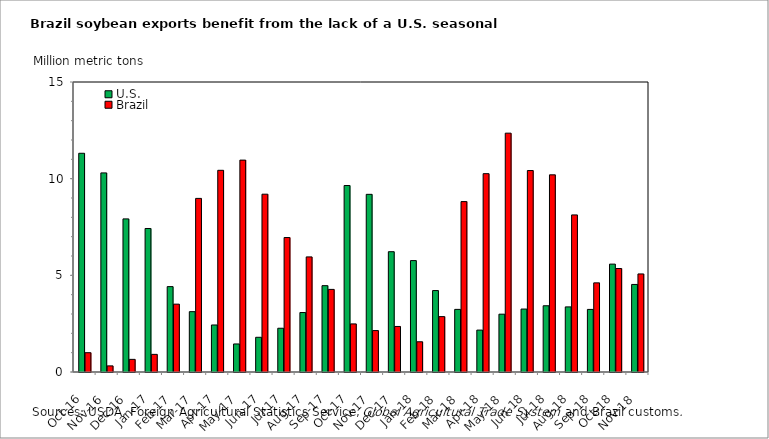
| Category | U.S. | Brazil |
|---|---|---|
| 2016-10-01 | 11.314 | 0.998 |
| 2016-11-01 | 10.299 | 0.316 |
| 2016-12-01 | 7.92 | 0.653 |
| 2017-01-01 | 7.423 | 0.912 |
| 2017-02-01 | 4.416 | 3.509 |
| 2017-03-01 | 3.121 | 8.979 |
| 2017-04-01 | 2.433 | 10.432 |
| 2017-05-01 | 1.45 | 10.96 |
| 2017-06-01 | 1.795 | 9.197 |
| 2017-07-01 | 2.263 | 6.955 |
| 2017-08-01 | 3.076 | 5.952 |
| 2017-09-01 | 4.465 | 4.272 |
| 2017-10-01 | 9.645 | 2.487 |
| 2017-11-01 | 9.189 | 2.143 |
| 2017-12-01 | 6.222 | 2.356 |
| 2018-01-01 | 5.763 | 1.564 |
| 2018-02-01 | 4.213 | 2.864 |
| 2018-03-01 | 3.239 | 8.814 |
| 2018-04-01 | 2.167 | 10.259 |
| 2018-05-01 | 2.991 | 12.353 |
| 2018-06-01 | 3.256 | 10.42 |
| 2018-07-01 | 3.427 | 10.198 |
| 2018-08-01 | 3.368 | 8.125 |
| 2018-09-01 | 3.237 | 4.611 |
| 2018-10-01 | 5.58 | 5.353 |
| 2018-11-01 | 4.528 | 5.072 |